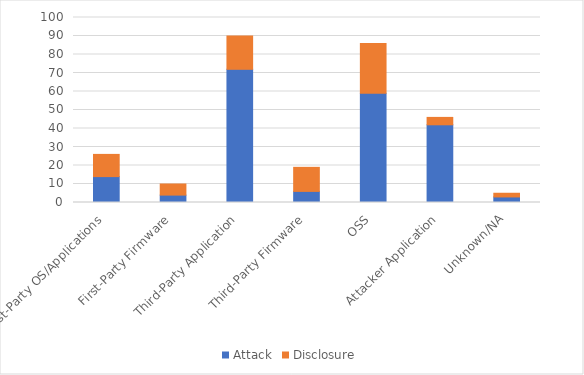
| Category | Attack | Disclosure |
|---|---|---|
| First-Party OS/Applications | 14 | 12 |
| First-Party Firmware | 4 | 6 |
| Third-Party Application | 72 | 18 |
| Third-Party Firmware | 6 | 13 |
| OSS | 59 | 27 |
| Attacker Application | 42 | 4 |
| Unknown/NA | 3 | 2 |